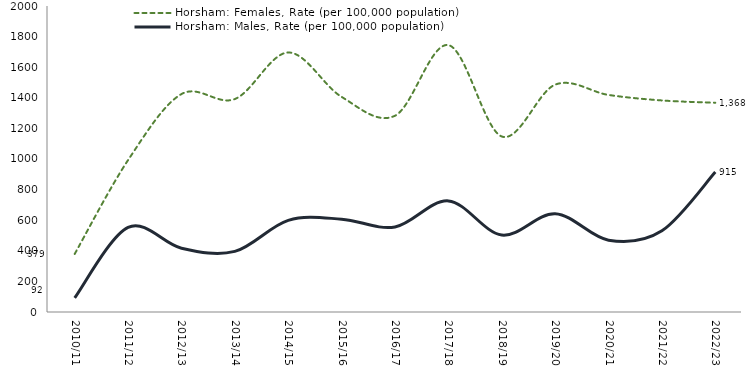
| Category | Horsham: Females, Rate (per 100,000 population) | Horsham: Males, Rate (per 100,000 population) |
|---|---|---|
| 2010/11 | 379.293 | 92.26 |
| 2011/12 | 992.835 | 552.712 |
| 2012/13 | 1424.356 | 417.133 |
| 2013/14 | 1391.781 | 396.201 |
| 2014/15 | 1696.206 | 599.259 |
| 2015/16 | 1405.887 | 606.857 |
| 2016/17 | 1282.763 | 555.527 |
| 2017/18 | 1744.567 | 726.063 |
| 2018/19 | 1147.17 | 503.145 |
| 2019/20 | 1485.869 | 642.538 |
| 2020/21 | 1418.723 | 469.577 |
| 2021/22 | 1382.696 | 531.036 |
| 2022/23 | 1367.639 | 915.039 |